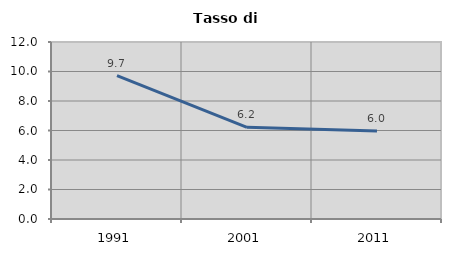
| Category | Tasso di disoccupazione   |
|---|---|
| 1991.0 | 9.714 |
| 2001.0 | 6.218 |
| 2011.0 | 5.97 |